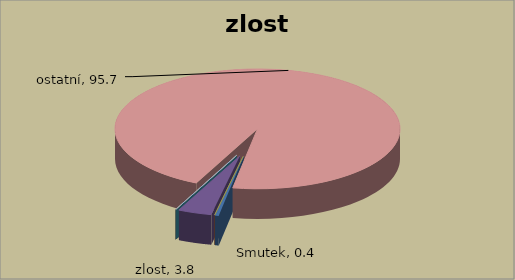
| Category | zlost |
|---|---|
| Smutek | 0.426 |
| úzkost | 0 |
| zoufalství | 0 |
| zlost | 3.83 |
| naděje | 0 |
| štěstí | 0 |
| radost | 0 |
| ostatní | 95.745 |